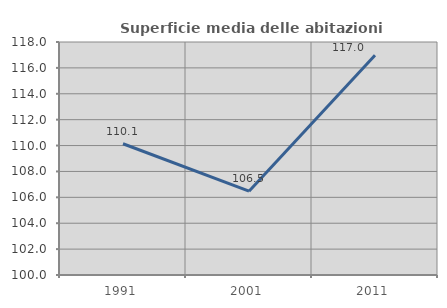
| Category | Superficie media delle abitazioni occupate |
|---|---|
| 1991.0 | 110.137 |
| 2001.0 | 106.475 |
| 2011.0 | 116.984 |